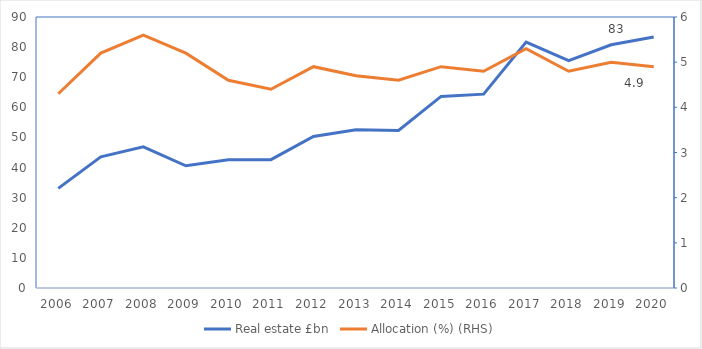
| Category | Real estate £bn |
|---|---|
| 2006.0 | 33.088 |
| 2007.0 | 43.56 |
| 2008.0 | 46.883 |
| 2009.0 | 40.581 |
| 2010.0 | 42.605 |
| 2011.0 | 42.614 |
| 2012.0 | 50.313 |
| 2013.0 | 52.57 |
| 2014.0 | 52.325 |
| 2015.0 | 63.617 |
| 2016.0 | 64.387 |
| 2017.0 | 81.678 |
| 2018.0 | 75.518 |
| 2019.0 | 80.765 |
| 2020.0 | 83.329 |